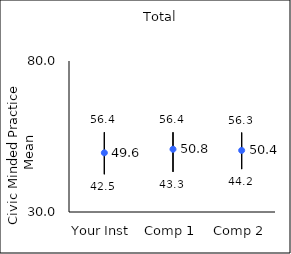
| Category | 25th percentile | 75th percentile | Mean |
|---|---|---|---|
| Your Inst | 42.5 | 56.4 | 49.6 |
| Comp 1 | 43.3 | 56.4 | 50.78 |
| Comp 2 | 44.2 | 56.3 | 50.4 |